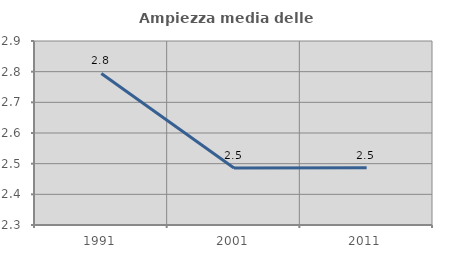
| Category | Ampiezza media delle famiglie |
|---|---|
| 1991.0 | 2.794 |
| 2001.0 | 2.486 |
| 2011.0 | 2.487 |